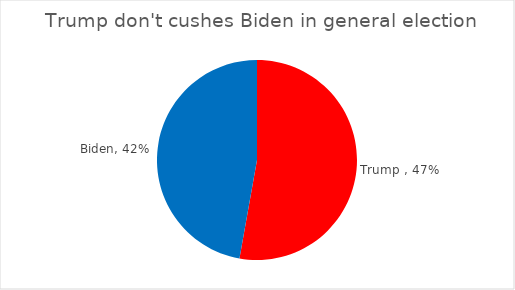
| Category | Series 0 |
|---|---|
| Trump  | 0.47 |
| Biden | 0.42 |